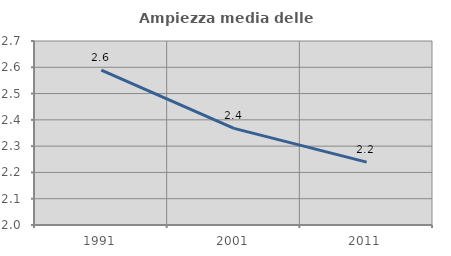
| Category | Ampiezza media delle famiglie |
|---|---|
| 1991.0 | 2.589 |
| 2001.0 | 2.368 |
| 2011.0 | 2.239 |